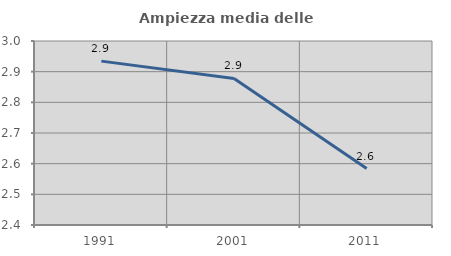
| Category | Ampiezza media delle famiglie |
|---|---|
| 1991.0 | 2.934 |
| 2001.0 | 2.878 |
| 2011.0 | 2.584 |